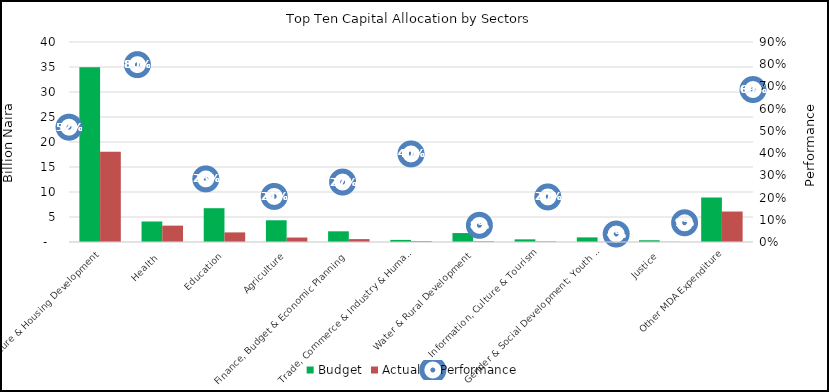
| Category | Budget  | Actual |
|---|---|---|
| Infrastructure & Housing Development | 34945000000 | 18055068648.71 |
| Health  | 4101250000 | 3273325662.89 |
| Education | 6759750000 | 1919328841.83 |
| Agriculture | 4348000000 | 891577107.25 |
| Finance, Budget & Economic Planning  | 2138405718 | 576771749.66 |
| Trade, Commerce & Industry & Human Dev. | 420000000 | 166467237.6 |
| Water & Rural Development  | 1790000000 | 134281726 |
| Information, Culture & Tourism | 530500000 | 107580215.47 |
| Gender & Social Development; Youth & Sports | 923500000 | 33070174.27 |
| Justice | 347500000 | 30057391.21 |
| Other MDA Expenditure | 8878447892 | 6091373602.21 |